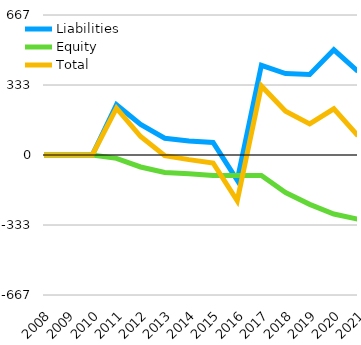
| Category | Liabilities  | Equity  | Total  |
|---|---|---|---|
| 2008 | 0 | 0 | 0 |
| 2009 | 0 | 0 | 0 |
| 2010 | 0 | 0 | 0 |
| 2011 | 239 | -16 | 223 |
| 2012 | 145 | -57 | 88 |
| 2013 | 80 | -83 | -3 |
| 2014 | 67 | -89 | -22 |
| 2015 | 60 | -98 | -38 |
| 2016 | -120 | -98 | -218 |
| 2017 | 427 | -98 | 329 |
| 2018 | 388 | -179 | 209 |
| 2019 | 383 | -235 | 148 |
| 2020 | 501.1 | -281 | 220.1 |
| 2021 | 397.6 | -305.9 | 91.7 |